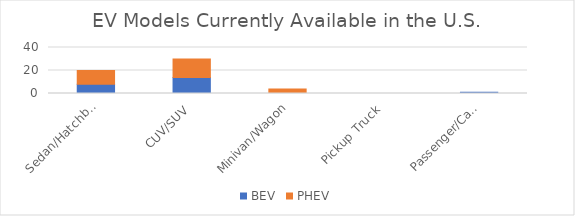
| Category | BEV | PHEV |
|---|---|---|
| Sedan/Hatchback | 8 | 12 |
| CUV/SUV | 14 | 16 |
| Minivan/Wagon | 0 | 4 |
| Pickup Truck | 0 | 0 |
| Passenger/Cargo Van | 1 | 0 |